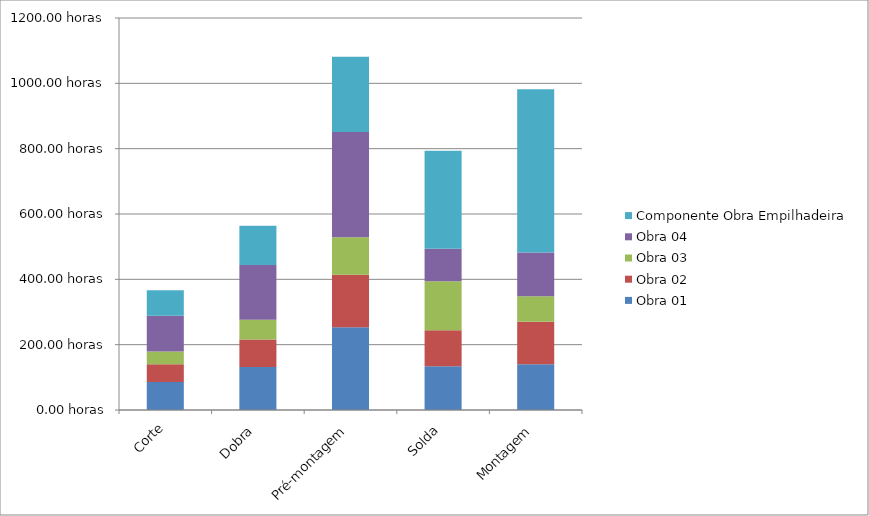
| Category | Obra 01 | Obra 02 | Obra 03 | Obra 04 | Componente Obra Empilhadeira |
|---|---|---|---|---|---|
| Corte | 85.8 | 54.6 | 39 | 109.2 | 78 |
| Dobra | 132 | 84 | 60 | 168 | 120 |
| Pré-montagem | 253 | 161 | 115 | 322 | 230 |
| Solda | 134 | 110 | 150 | 100 | 300 |
| Montagem | 140 | 130 | 78 | 134 | 500 |